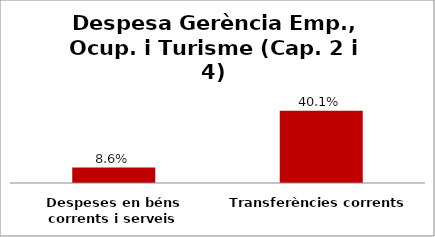
| Category | Series 0 |
|---|---|
| Despeses en béns corrents i serveis | 0.086 |
| Transferències corrents | 0.401 |